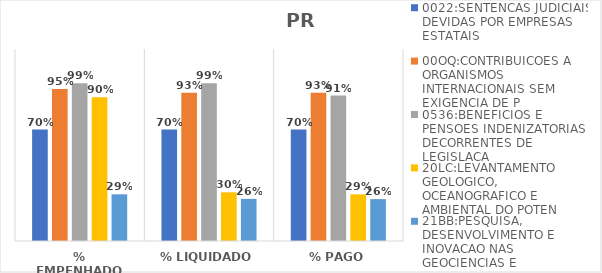
| Category | 0022:SENTENCAS JUDICIAIS DEVIDAS POR EMPRESAS ESTATAIS | 00OQ:CONTRIBUICOES A ORGANISMOS INTERNACIONAIS SEM EXIGENCIA DE P | 0536:BENEFICIOS E PENSOES INDENIZATORIAS DECORRENTES DE LEGISLACA | 20LC:LEVANTAMENTO GEOLOGICO, OCEANOGRAFICO E AMBIENTAL DO POTEN | 21BB:PESQUISA, DESENVOLVIMENTO E INOVACAO NAS GEOCIENCIAS E |
|---|---|---|---|---|---|
| % EMPENHADO | 0.697 | 0.95 | 0.985 | 0.899 | 0.292 |
| % LIQUIDADO | 0.697 | 0.926 | 0.985 | 0.304 | 0.263 |
| % PAGO | 0.697 | 0.926 | 0.909 | 0.291 | 0.262 |